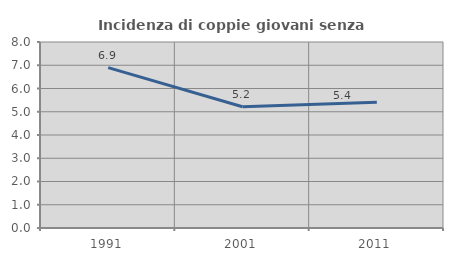
| Category | Incidenza di coppie giovani senza figli |
|---|---|
| 1991.0 | 6.897 |
| 2001.0 | 5.217 |
| 2011.0 | 5.405 |